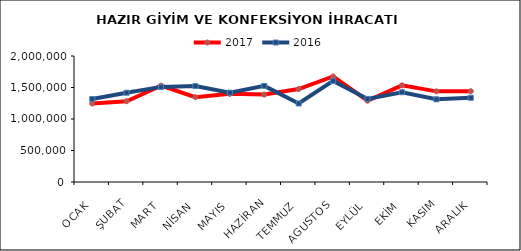
| Category | 2017 | 2016 |
|---|---|---|
| OCAK | 1245714.258 | 1317690.757 |
| ŞUBAT | 1282290.723 | 1417235.431 |
| MART | 1529907.713 | 1509605.316 |
| NİSAN | 1346031.132 | 1522645.995 |
| MAYIS | 1399011.133 | 1417793.282 |
| HAZİRAN | 1387362.13 | 1526209.703 |
| TEMMUZ | 1476113.724 | 1246136.342 |
| AGUSTOS | 1674998.937 | 1605432.94 |
| EYLÜL | 1290020.047 | 1318760.988 |
| EKİM | 1534708.777 | 1424982.54 |
| KASIM | 1438866.299 | 1312530.637 |
| ARALIK | 1440335.471 | 1337050.388 |